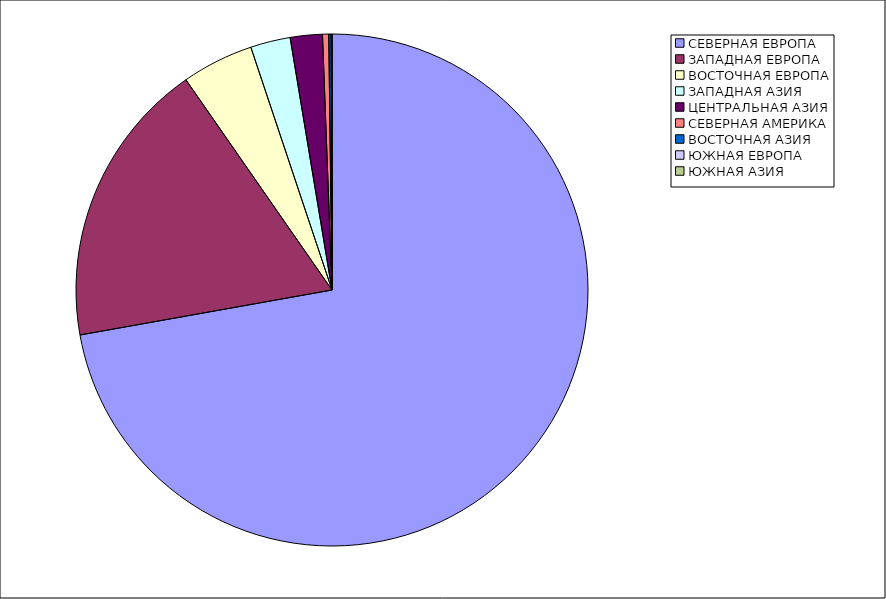
| Category | Оборот |
|---|---|
| СЕВЕРНАЯ ЕВРОПА | 72.186 |
| ЗАПАДНАЯ ЕВРОПА | 18.148 |
| ВОСТОЧНАЯ ЕВРОПА | 4.532 |
| ЗАПАДНАЯ АЗИЯ | 2.515 |
| ЦЕНТРАЛЬНАЯ АЗИЯ | 2.027 |
| СЕВЕРНАЯ АМЕРИКА | 0.389 |
| ВОСТОЧНАЯ АЗИЯ | 0.148 |
| ЮЖНАЯ ЕВРОПА | 0.054 |
| ЮЖНАЯ АЗИЯ | 0 |